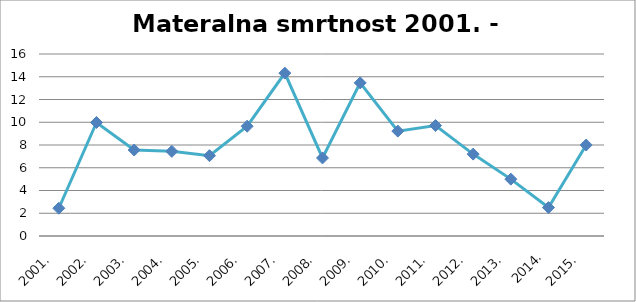
| Category | Series 0 |
|---|---|
| 2001.  | 2.44 |
| 2002.  | 9.98 |
| 2003.  | 7.56 |
| 2004.  | 7.44 |
| 2005.  | 7.06 |
| 2006.  | 9.65 |
| 2007.  | 14.32 |
| 2008.  | 6.86 |
| 2009.  | 13.46 |
| 2010.  | 9.22 |
| 2011.  | 9.71 |
| 2012.  | 7.2 |
| 2013.  | 5 |
| 2014. | 2.5 |
| 2015.  | 8 |